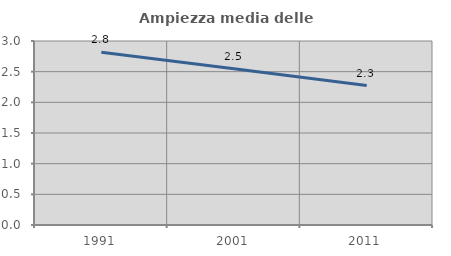
| Category | Ampiezza media delle famiglie |
|---|---|
| 1991.0 | 2.818 |
| 2001.0 | 2.548 |
| 2011.0 | 2.274 |